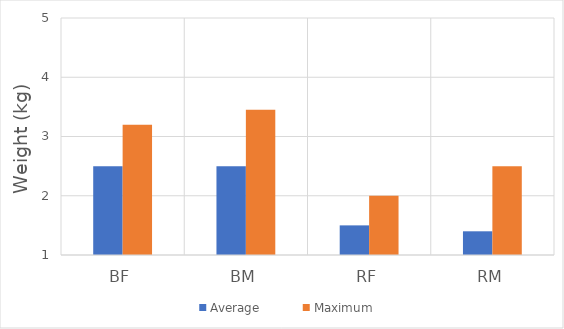
| Category | Average | Maximum |
|---|---|---|
| BF | 2.5 | 3.2 |
| BM | 2.5 | 3.45 |
| RF | 1.5 | 2 |
| RM | 1.4 | 2.5 |